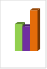
| Category | област Пазарджик |
|---|---|
| летен сезон 2019  | 256608 |
| летен сезон 2021  | 235112 |
| летен сезон 2022 г.  | 387602 |